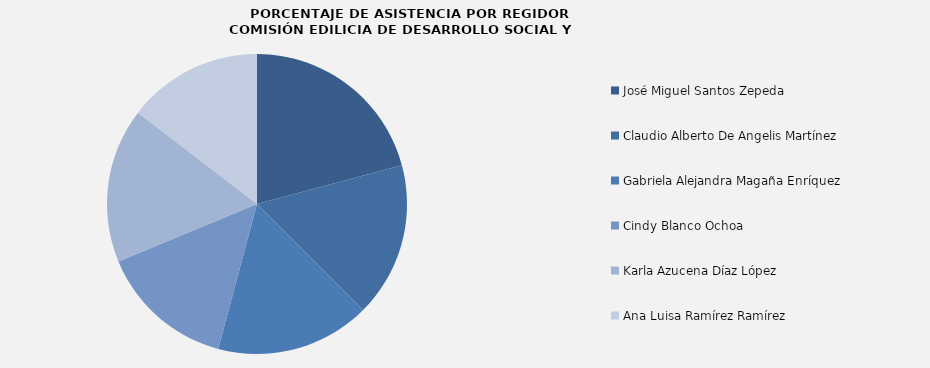
| Category | Series 0 |
|---|---|
| José Miguel Santos Zepeda  | 100 |
| Claudio Alberto De Angelis Martínez | 80 |
| Gabriela Alejandra Magaña Enríquez | 80 |
| Cindy Blanco Ochoa | 70 |
| Karla Azucena Díaz López | 80 |
| Ana Luisa Ramírez Ramírez | 70 |